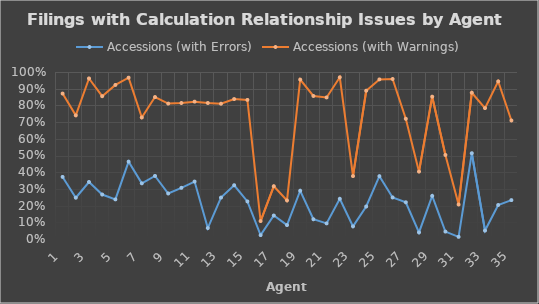
| Category | Accessions (with Errors) | Accessions (with Warnings) |
|---|---|---|
| 1.0 | 0.372 | 0.871 |
| 2.0 | 0.247 | 0.74 |
| 3.0 | 0.341 | 0.961 |
| 4.0 | 0.266 | 0.855 |
| 5.0 | 0.237 | 0.923 |
| 6.0 | 0.463 | 0.966 |
| 7.0 | 0.333 | 0.728 |
| 8.0 | 0.378 | 0.85 |
| 9.0 | 0.273 | 0.811 |
| 10.0 | 0.306 | 0.814 |
| 11.0 | 0.344 | 0.822 |
| 12.0 | 0.066 | 0.814 |
| 13.0 | 0.248 | 0.81 |
| 14.0 | 0.322 | 0.838 |
| 15.0 | 0.225 | 0.833 |
| 16.0 | 0.023 | 0.107 |
| 17.0 | 0.141 | 0.316 |
| 18.0 | 0.083 | 0.231 |
| 19.0 | 0.289 | 0.954 |
| 20.0 | 0.118 | 0.856 |
| 21.0 | 0.093 | 0.848 |
| 22.0 | 0.241 | 0.968 |
| 23.0 | 0.075 | 0.377 |
| 24.0 | 0.195 | 0.888 |
| 25.0 | 0.376 | 0.956 |
| 26.0 | 0.249 | 0.958 |
| 27.0 | 0.22 | 0.72 |
| 28.0 | 0.039 | 0.403 |
| 29.0 | 0.258 | 0.852 |
| 30.0 | 0.044 | 0.503 |
| 31.0 | 0.013 | 0.206 |
| 32.0 | 0.513 | 0.876 |
| 33.0 | 0.051 | 0.784 |
| 34.0 | 0.204 | 0.944 |
| 35.0 | 0.233 | 0.71 |